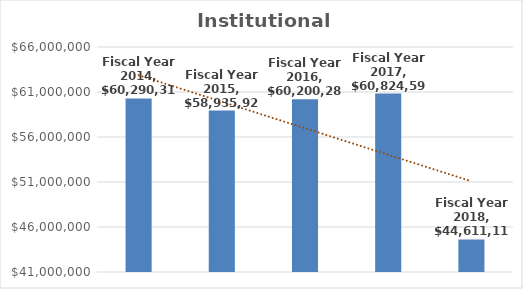
| Category | Institutional Support |
|---|---|
| Fiscal Year 2014 | 60290314 |
| Fiscal Year 2015 | 58935921 |
| Fiscal Year 2016 | 60200287 |
| Fiscal Year 2017 | 60824590 |
| Fiscal Year 2018 | 44611119 |